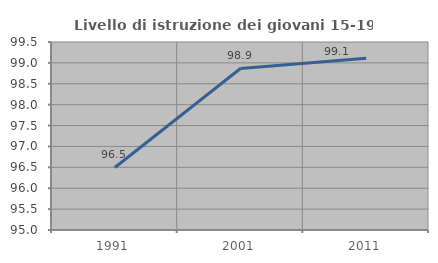
| Category | Livello di istruzione dei giovani 15-19 anni |
|---|---|
| 1991.0 | 96.496 |
| 2001.0 | 98.866 |
| 2011.0 | 99.112 |